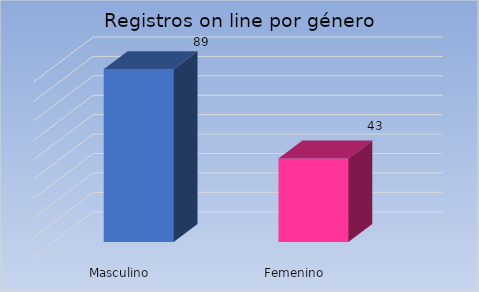
| Category | Cantidad |
|---|---|
| Masculino | 89 |
| Femenino | 43 |